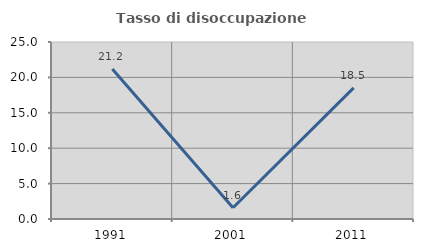
| Category | Tasso di disoccupazione giovanile  |
|---|---|
| 1991.0 | 21.186 |
| 2001.0 | 1.587 |
| 2011.0 | 18.519 |